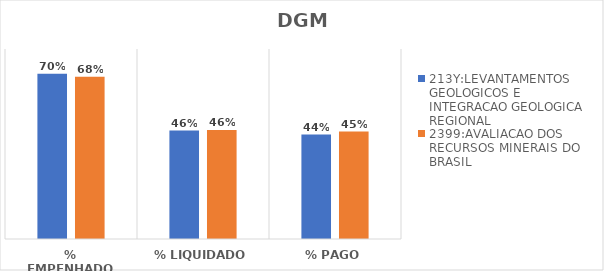
| Category | 213Y:LEVANTAMENTOS GEOLOGICOS E INTEGRACAO GEOLOGICA REGIONAL | 2399:AVALIACAO DOS RECURSOS MINERAIS DO BRASIL |
|---|---|---|
| % EMPENHADO | 0.695 | 0.683 |
| % LIQUIDADO | 0.457 | 0.459 |
| % PAGO | 0.44 | 0.452 |